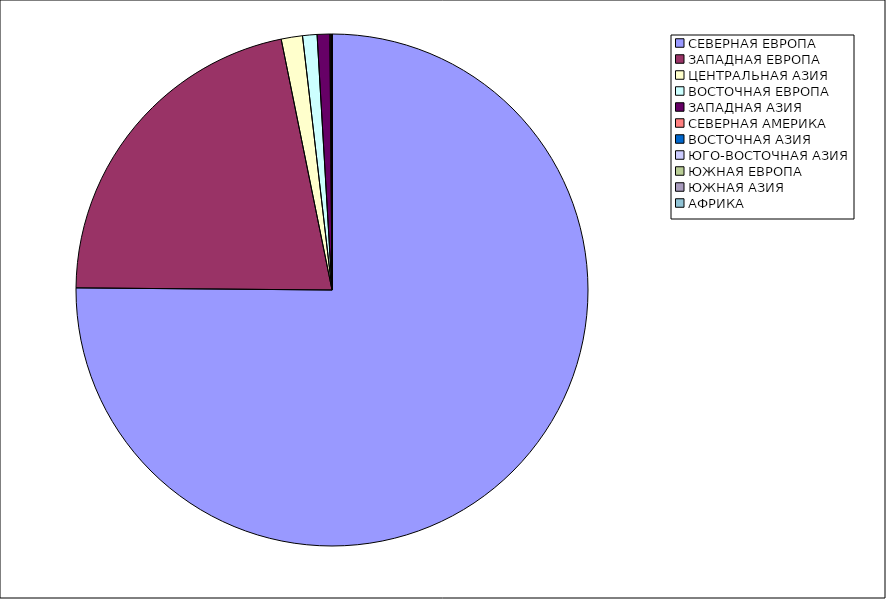
| Category | Оборот |
|---|---|
| СЕВЕРНАЯ ЕВРОПА | 75.133 |
| ЗАПАДНАЯ ЕВРОПА | 21.685 |
| ЦЕНТРАЛЬНАЯ АЗИЯ | 1.341 |
| ВОСТОЧНАЯ ЕВРОПА | 0.912 |
| ЗАПАДНАЯ АЗИЯ | 0.799 |
| СЕВЕРНАЯ АМЕРИКА | 0.061 |
| ВОСТОЧНАЯ АЗИЯ | 0.056 |
| ЮГО-ВОСТОЧНАЯ АЗИЯ | 0.011 |
| ЮЖНАЯ ЕВРОПА | 0.002 |
| ЮЖНАЯ АЗИЯ | 0 |
| АФРИКА | 0 |